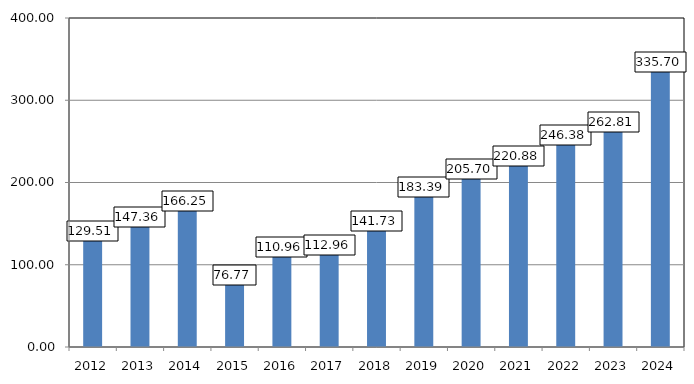
| Category | Series 0 |
|---|---|
| 2012.0 | 129.51 |
| 2013.0 | 147.358 |
| 2014.0 | 166.25 |
| 2015.0 | 76.77 |
| 2016.0 | 110.955 |
| 2017.0 | 112.96 |
| 2018.0 | 141.725 |
| 2019.0 | 183.39 |
| 2020.0 | 205.7 |
| 2021.0 | 220.88 |
| 2022.0 | 246.38 |
| 2023.0 | 262.81 |
| 2024.0 | 335.705 |